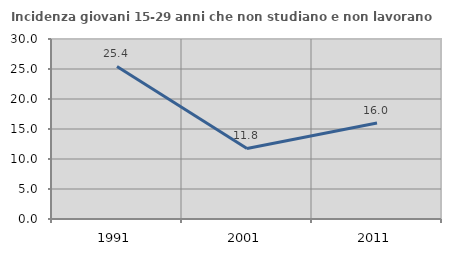
| Category | Incidenza giovani 15-29 anni che non studiano e non lavorano  |
|---|---|
| 1991.0 | 25.424 |
| 2001.0 | 11.765 |
| 2011.0 | 16 |